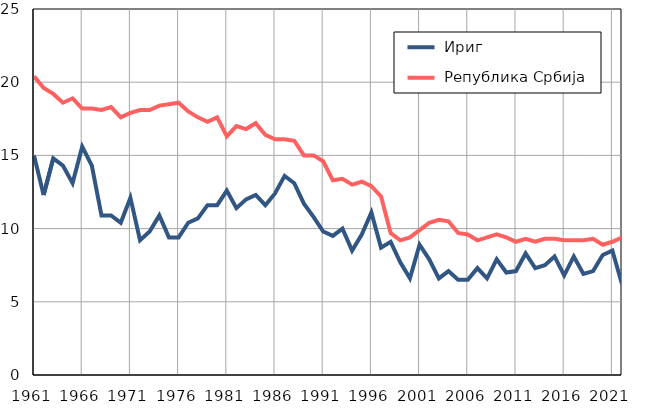
| Category |  Ириг |  Република Србија |
|---|---|---|
| 1961.0 | 15 | 20.4 |
| 1962.0 | 12.3 | 19.6 |
| 1963.0 | 14.8 | 19.2 |
| 1964.0 | 14.3 | 18.6 |
| 1965.0 | 13.1 | 18.9 |
| 1966.0 | 15.6 | 18.2 |
| 1967.0 | 14.3 | 18.2 |
| 1968.0 | 10.9 | 18.1 |
| 1969.0 | 10.9 | 18.3 |
| 1970.0 | 10.4 | 17.6 |
| 1971.0 | 12.1 | 17.9 |
| 1972.0 | 9.2 | 18.1 |
| 1973.0 | 9.8 | 18.1 |
| 1974.0 | 10.9 | 18.4 |
| 1975.0 | 9.4 | 18.5 |
| 1976.0 | 9.4 | 18.6 |
| 1977.0 | 10.4 | 18 |
| 1978.0 | 10.7 | 17.6 |
| 1979.0 | 11.6 | 17.3 |
| 1980.0 | 11.6 | 17.6 |
| 1981.0 | 12.6 | 16.3 |
| 1982.0 | 11.4 | 17 |
| 1983.0 | 12 | 16.8 |
| 1984.0 | 12.3 | 17.2 |
| 1985.0 | 11.6 | 16.4 |
| 1986.0 | 12.4 | 16.1 |
| 1987.0 | 13.6 | 16.1 |
| 1988.0 | 13.1 | 16 |
| 1989.0 | 11.7 | 15 |
| 1990.0 | 10.8 | 15 |
| 1991.0 | 9.8 | 14.6 |
| 1992.0 | 9.5 | 13.3 |
| 1993.0 | 10 | 13.4 |
| 1994.0 | 8.5 | 13 |
| 1995.0 | 9.6 | 13.2 |
| 1996.0 | 11.1 | 12.9 |
| 1997.0 | 8.7 | 12.2 |
| 1998.0 | 9.1 | 9.7 |
| 1999.0 | 7.7 | 9.2 |
| 2000.0 | 6.6 | 9.4 |
| 2001.0 | 8.9 | 9.9 |
| 2002.0 | 7.9 | 10.4 |
| 2003.0 | 6.6 | 10.6 |
| 2004.0 | 7.1 | 10.5 |
| 2005.0 | 6.5 | 9.7 |
| 2006.0 | 6.5 | 9.6 |
| 2007.0 | 7.3 | 9.2 |
| 2008.0 | 6.6 | 9.4 |
| 2009.0 | 7.9 | 9.6 |
| 2010.0 | 7 | 9.4 |
| 2011.0 | 7.1 | 9.1 |
| 2012.0 | 8.3 | 9.3 |
| 2013.0 | 7.3 | 9.1 |
| 2014.0 | 7.5 | 9.3 |
| 2015.0 | 8.1 | 9.3 |
| 2016.0 | 6.8 | 9.2 |
| 2017.0 | 8.1 | 9.2 |
| 2018.0 | 6.9 | 9.2 |
| 2019.0 | 7.1 | 9.3 |
| 2020.0 | 8.2 | 8.9 |
| 2021.0 | 8.5 | 9.1 |
| 2022.0 | 6.2 | 9.4 |